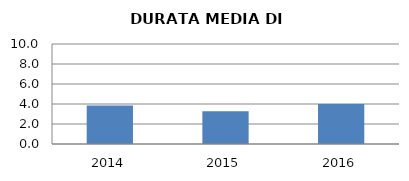
| Category | 2014 2015 2016 |
|---|---|
| 2014.0 | 3.857 |
| 2015.0 | 3.263 |
| 2016.0 | 4 |